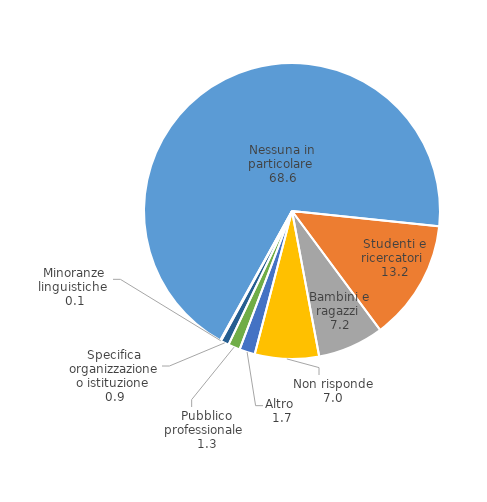
| Category | Series 0 |
|---|---|
| Nessuna in particolare  | 68.6 |
| Studenti e ricercatori  | 13.2 |
| Bambini e ragazzi  | 7.2 |
| Non risponde | 7 |
| Altro  | 1.7 |
| Pubblico professionale  | 1.3 |
| Specifica organizzazione o istituzione  | 0.9 |
| Minoranze linguistiche  | 0.1 |